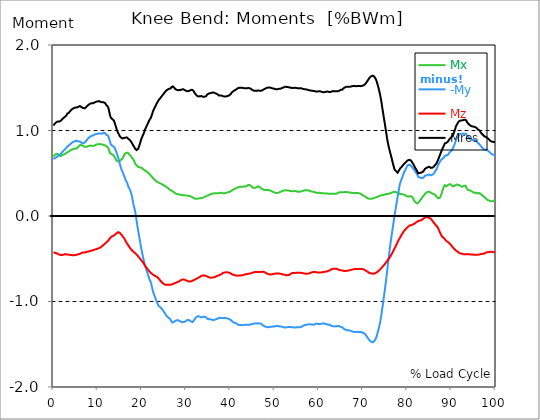
| Category |  Mx |  -My |  Mz |  Mres |
|---|---|---|---|---|
| 0.0 | 0.693 | 0.667 | -0.427 | 1.058 |
| 0.167348456675344 | 0.704 | 0.671 | -0.428 | 1.069 |
| 0.334696913350688 | 0.715 | 0.676 | -0.429 | 1.08 |
| 0.5020453700260321 | 0.722 | 0.68 | -0.431 | 1.089 |
| 0.669393826701376 | 0.727 | 0.686 | -0.435 | 1.096 |
| 0.83674228337672 | 0.727 | 0.693 | -0.439 | 1.102 |
| 1.0040907400520642 | 0.724 | 0.7 | -0.443 | 1.106 |
| 1.1621420602454444 | 0.718 | 0.706 | -0.447 | 1.106 |
| 1.3294905169207885 | 0.709 | 0.709 | -0.45 | 1.104 |
| 1.4968389735961325 | 0.701 | 0.717 | -0.454 | 1.105 |
| 1.6641874302714765 | 0.701 | 0.728 | -0.457 | 1.113 |
| 1.8315358869468206 | 0.707 | 0.736 | -0.458 | 1.122 |
| 1.9988843436221646 | 0.712 | 0.747 | -0.457 | 1.133 |
| 2.1662328002975086 | 0.717 | 0.756 | -0.455 | 1.14 |
| 2.333581256972853 | 0.721 | 0.766 | -0.451 | 1.149 |
| 2.5009297136481967 | 0.724 | 0.776 | -0.45 | 1.156 |
| 2.6682781703235405 | 0.726 | 0.782 | -0.447 | 1.162 |
| 2.8356266269988843 | 0.728 | 0.788 | -0.446 | 1.166 |
| 3.002975083674229 | 0.738 | 0.801 | -0.449 | 1.181 |
| 3.1703235403495724 | 0.749 | 0.815 | -0.45 | 1.198 |
| 3.337671997024917 | 0.75 | 0.821 | -0.452 | 1.205 |
| 3.4957233172182973 | 0.75 | 0.824 | -0.453 | 1.207 |
| 3.663071773893641 | 0.761 | 0.833 | -0.454 | 1.22 |
| 3.8304202305689854 | 0.768 | 0.841 | -0.456 | 1.231 |
| 3.997768687244329 | 0.773 | 0.849 | -0.456 | 1.238 |
| 4.165117143919673 | 0.776 | 0.857 | -0.458 | 1.247 |
| 4.332465600595017 | 0.779 | 0.863 | -0.459 | 1.253 |
| 4.499814057270361 | 0.78 | 0.867 | -0.46 | 1.258 |
| 4.667162513945706 | 0.784 | 0.871 | -0.46 | 1.263 |
| 4.834510970621049 | 0.789 | 0.874 | -0.458 | 1.267 |
| 5.001859427296393 | 0.789 | 0.879 | -0.455 | 1.269 |
| 5.169207883971737 | 0.791 | 0.881 | -0.454 | 1.272 |
| 5.336556340647081 | 0.793 | 0.877 | -0.452 | 1.27 |
| 5.503904797322425 | 0.803 | 0.874 | -0.45 | 1.273 |
| 5.671253253997769 | 0.812 | 0.872 | -0.448 | 1.277 |
| 5.82930457419115 | 0.82 | 0.872 | -0.446 | 1.28 |
| 5.996653030866494 | 0.829 | 0.871 | -0.443 | 1.286 |
| 6.164001487541838 | 0.834 | 0.867 | -0.439 | 1.285 |
| 6.331349944217181 | 0.83 | 0.856 | -0.434 | 1.274 |
| 6.498698400892526 | 0.827 | 0.85 | -0.43 | 1.266 |
| 6.66604685756787 | 0.822 | 0.851 | -0.428 | 1.264 |
| 6.833395314243213 | 0.814 | 0.852 | -0.426 | 1.259 |
| 7.000743770918558 | 0.809 | 0.856 | -0.426 | 1.259 |
| 7.168092227593902 | 0.808 | 0.863 | -0.425 | 1.263 |
| 7.335440684269246 | 0.81 | 0.872 | -0.423 | 1.269 |
| 7.50278914094459 | 0.809 | 0.883 | -0.421 | 1.276 |
| 7.6701375976199335 | 0.812 | 0.896 | -0.418 | 1.287 |
| 7.837486054295278 | 0.815 | 0.906 | -0.415 | 1.293 |
| 7.995537374488658 | 0.819 | 0.915 | -0.414 | 1.302 |
| 8.162885831164003 | 0.822 | 0.922 | -0.412 | 1.31 |
| 8.330234287839346 | 0.823 | 0.927 | -0.409 | 1.314 |
| 8.49758274451469 | 0.822 | 0.932 | -0.407 | 1.316 |
| 8.664931201190035 | 0.822 | 0.937 | -0.405 | 1.319 |
| 8.832279657865378 | 0.821 | 0.941 | -0.402 | 1.321 |
| 8.999628114540721 | 0.819 | 0.944 | -0.399 | 1.32 |
| 9.166976571216066 | 0.821 | 0.948 | -0.397 | 1.323 |
| 9.334325027891412 | 0.824 | 0.953 | -0.393 | 1.328 |
| 9.501673484566755 | 0.829 | 0.957 | -0.39 | 1.333 |
| 9.669021941242098 | 0.835 | 0.96 | -0.388 | 1.337 |
| 9.836370397917442 | 0.837 | 0.962 | -0.385 | 1.34 |
| 10.003718854592787 | 0.838 | 0.961 | -0.382 | 1.339 |
| 10.17106731126813 | 0.841 | 0.964 | -0.379 | 1.341 |
| 10.329118631461512 | 0.843 | 0.967 | -0.376 | 1.344 |
| 10.496467088136853 | 0.842 | 0.968 | -0.37 | 1.342 |
| 10.663815544812199 | 0.839 | 0.963 | -0.366 | 1.335 |
| 10.831164001487544 | 0.838 | 0.961 | -0.362 | 1.332 |
| 10.998512458162887 | 0.837 | 0.964 | -0.353 | 1.331 |
| 11.16586091483823 | 0.836 | 0.966 | -0.348 | 1.33 |
| 11.333209371513574 | 0.832 | 0.973 | -0.338 | 1.331 |
| 11.50055782818892 | 0.827 | 0.977 | -0.328 | 1.328 |
| 11.667906284864264 | 0.826 | 0.97 | -0.323 | 1.322 |
| 11.835254741539607 | 0.82 | 0.959 | -0.316 | 1.309 |
| 12.00260319821495 | 0.815 | 0.949 | -0.308 | 1.296 |
| 12.169951654890292 | 0.809 | 0.945 | -0.301 | 1.29 |
| 12.337300111565641 | 0.8 | 0.94 | -0.292 | 1.279 |
| 12.504648568240984 | 0.781 | 0.924 | -0.28 | 1.253 |
| 12.662699888434362 | 0.757 | 0.893 | -0.269 | 1.213 |
| 12.830048345109708 | 0.735 | 0.863 | -0.258 | 1.174 |
| 12.997396801785053 | 0.725 | 0.839 | -0.248 | 1.149 |
| 13.164745258460396 | 0.723 | 0.827 | -0.24 | 1.138 |
| 13.33209371513574 | 0.72 | 0.823 | -0.236 | 1.133 |
| 13.499442171811083 | 0.715 | 0.818 | -0.234 | 1.125 |
| 13.666790628486426 | 0.707 | 0.817 | -0.228 | 1.118 |
| 13.834139085161771 | 0.692 | 0.802 | -0.221 | 1.095 |
| 14.001487541837117 | 0.674 | 0.78 | -0.215 | 1.066 |
| 14.16883599851246 | 0.656 | 0.76 | -0.207 | 1.039 |
| 14.336184455187803 | 0.644 | 0.735 | -0.2 | 1.012 |
| 14.503532911863147 | 0.637 | 0.707 | -0.192 | 0.987 |
| 14.670881368538492 | 0.639 | 0.679 | -0.189 | 0.969 |
| 14.828932688731873 | 0.644 | 0.649 | -0.19 | 0.953 |
| 14.996281145407215 | 0.644 | 0.615 | -0.197 | 0.935 |
| 15.163629602082558 | 0.65 | 0.584 | -0.206 | 0.924 |
| 15.330978058757903 | 0.659 | 0.554 | -0.215 | 0.916 |
| 15.498326515433247 | 0.666 | 0.53 | -0.226 | 0.909 |
| 15.665674972108594 | 0.675 | 0.513 | -0.237 | 0.907 |
| 15.833023428783937 | 0.693 | 0.491 | -0.249 | 0.911 |
| 16.00037188545928 | 0.713 | 0.467 | -0.261 | 0.913 |
| 16.167720342134626 | 0.727 | 0.447 | -0.277 | 0.917 |
| 16.335068798809967 | 0.736 | 0.422 | -0.292 | 0.917 |
| 16.502417255485312 | 0.738 | 0.414 | -0.308 | 0.921 |
| 16.669765712160658 | 0.74 | 0.389 | -0.322 | 0.917 |
| 16.837114168836 | 0.739 | 0.362 | -0.336 | 0.909 |
| 17.004462625511344 | 0.731 | 0.337 | -0.348 | 0.9 |
| 17.16251394570472 | 0.72 | 0.323 | -0.362 | 0.893 |
| 17.32986240238007 | 0.713 | 0.303 | -0.374 | 0.887 |
| 17.497210859055414 | 0.702 | 0.28 | -0.385 | 0.875 |
| 17.664559315730756 | 0.691 | 0.254 | -0.396 | 0.863 |
| 17.8319077724061 | 0.679 | 0.21 | -0.405 | 0.847 |
| 17.999256229081443 | 0.667 | 0.167 | -0.413 | 0.832 |
| 18.166604685756788 | 0.653 | 0.121 | -0.421 | 0.818 |
| 18.333953142432133 | 0.633 | 0.089 | -0.428 | 0.802 |
| 18.501301599107478 | 0.613 | 0.051 | -0.436 | 0.786 |
| 18.668650055782823 | 0.6 | -0.001 | -0.443 | 0.777 |
| 18.835998512458165 | 0.591 | -0.062 | -0.451 | 0.771 |
| 19.00334696913351 | 0.582 | -0.116 | -0.461 | 0.775 |
| 19.170695425808855 | 0.575 | -0.169 | -0.471 | 0.786 |
| 19.338043882484197 | 0.571 | -0.22 | -0.481 | 0.807 |
| 19.496095202677576 | 0.57 | -0.27 | -0.493 | 0.834 |
| 19.66344365935292 | 0.568 | -0.319 | -0.504 | 0.862 |
| 19.830792116028263 | 0.565 | -0.365 | -0.514 | 0.893 |
| 19.998140572703612 | 0.562 | -0.41 | -0.526 | 0.916 |
| 20.165489029378953 | 0.554 | -0.453 | -0.537 | 0.936 |
| 20.3328374860543 | 0.546 | -0.497 | -0.549 | 0.954 |
| 20.500185942729644 | 0.538 | -0.532 | -0.562 | 0.976 |
| 20.667534399404985 | 0.533 | -0.573 | -0.575 | 1 |
| 20.83488285608033 | 0.527 | -0.601 | -0.589 | 1.022 |
| 21.002231312755672 | 0.523 | -0.623 | -0.601 | 1.042 |
| 21.16957976943102 | 0.518 | -0.65 | -0.612 | 1.062 |
| 21.336928226106362 | 0.51 | -0.676 | -0.623 | 1.079 |
| 21.504276682781704 | 0.502 | -0.704 | -0.635 | 1.098 |
| 21.67162513945705 | 0.493 | -0.732 | -0.645 | 1.118 |
| 21.82967645965043 | 0.484 | -0.751 | -0.655 | 1.132 |
| 21.997024916325774 | 0.475 | -0.769 | -0.664 | 1.145 |
| 22.16437337300112 | 0.464 | -0.801 | -0.671 | 1.165 |
| 22.33172182967646 | 0.455 | -0.839 | -0.678 | 1.193 |
| 22.499070286351806 | 0.444 | -0.878 | -0.685 | 1.221 |
| 22.666418743027148 | 0.435 | -0.904 | -0.691 | 1.241 |
| 22.833767199702496 | 0.427 | -0.927 | -0.695 | 1.259 |
| 23.00111565637784 | 0.42 | -0.95 | -0.701 | 1.277 |
| 23.168464113053183 | 0.413 | -0.975 | -0.705 | 1.295 |
| 23.335812569728528 | 0.407 | -0.998 | -0.709 | 1.313 |
| 23.50316102640387 | 0.402 | -1.018 | -0.716 | 1.327 |
| 23.670509483079215 | 0.395 | -1.039 | -0.723 | 1.344 |
| 23.83785793975456 | 0.389 | -1.053 | -0.734 | 1.358 |
| 23.995909259947936 | 0.384 | -1.063 | -0.744 | 1.369 |
| 24.163257716623285 | 0.379 | -1.066 | -0.755 | 1.377 |
| 24.330606173298627 | 0.379 | -1.078 | -0.764 | 1.39 |
| 24.49795462997397 | 0.374 | -1.086 | -0.774 | 1.401 |
| 24.665303086649313 | 0.368 | -1.094 | -0.782 | 1.411 |
| 24.83265154332466 | 0.364 | -1.107 | -0.79 | 1.423 |
| 25.0 | 0.358 | -1.121 | -0.795 | 1.435 |
| 25.167348456675345 | 0.353 | -1.134 | -0.8 | 1.446 |
| 25.334696913350694 | 0.349 | -1.146 | -0.803 | 1.456 |
| 25.502045370026035 | 0.344 | -1.16 | -0.805 | 1.466 |
| 25.669393826701377 | 0.336 | -1.174 | -0.806 | 1.476 |
| 25.836742283376722 | 0.33 | -1.18 | -0.805 | 1.479 |
| 26.004090740052067 | 0.323 | -1.189 | -0.805 | 1.484 |
| 26.17143919672741 | 0.317 | -1.197 | -0.806 | 1.489 |
| 26.329490516920792 | 0.308 | -1.201 | -0.805 | 1.489 |
| 26.49683897359613 | 0.301 | -1.207 | -0.804 | 1.491 |
| 26.66418743027148 | 0.298 | -1.229 | -0.802 | 1.506 |
| 26.831535886946828 | 0.294 | -1.245 | -0.799 | 1.516 |
| 26.998884343622166 | 0.288 | -1.249 | -0.797 | 1.516 |
| 27.166232800297514 | 0.281 | -1.241 | -0.793 | 1.507 |
| 27.333581256972852 | 0.274 | -1.237 | -0.788 | 1.499 |
| 27.5009297136482 | 0.267 | -1.228 | -0.785 | 1.489 |
| 27.668278170323543 | 0.262 | -1.222 | -0.781 | 1.481 |
| 27.835626626998888 | 0.26 | -1.221 | -0.777 | 1.477 |
| 28.002975083674233 | 0.256 | -1.22 | -0.774 | 1.474 |
| 28.170323540349575 | 0.254 | -1.218 | -0.77 | 1.47 |
| 28.33767199702492 | 0.252 | -1.221 | -0.766 | 1.471 |
| 28.50502045370026 | 0.25 | -1.228 | -0.76 | 1.474 |
| 28.663071773893645 | 0.25 | -1.232 | -0.756 | 1.475 |
| 28.830420230568986 | 0.248 | -1.236 | -0.751 | 1.475 |
| 28.99776868724433 | 0.245 | -1.241 | -0.746 | 1.478 |
| 29.165117143919673 | 0.243 | -1.243 | -0.742 | 1.478 |
| 29.33246560059502 | 0.244 | -1.25 | -0.742 | 1.483 |
| 29.499814057270367 | 0.242 | -1.24 | -0.742 | 1.474 |
| 29.66716251394571 | 0.242 | -1.239 | -0.745 | 1.474 |
| 29.834510970621054 | 0.241 | -1.234 | -0.749 | 1.47 |
| 30.00185942729639 | 0.24 | -1.226 | -0.753 | 1.464 |
| 30.169207883971744 | 0.239 | -1.221 | -0.756 | 1.462 |
| 30.33655634064708 | 0.237 | -1.218 | -0.759 | 1.46 |
| 30.50390479732243 | 0.237 | -1.214 | -0.763 | 1.459 |
| 30.671253253997772 | 0.237 | -1.215 | -0.766 | 1.462 |
| 30.829304574191156 | 0.234 | -1.222 | -0.767 | 1.467 |
| 30.996653030866494 | 0.23 | -1.229 | -0.766 | 1.472 |
| 31.164001487541842 | 0.226 | -1.235 | -0.764 | 1.476 |
| 31.331349944217187 | 0.223 | -1.237 | -0.761 | 1.476 |
| 31.498698400892525 | 0.219 | -1.24 | -0.756 | 1.475 |
| 31.666046857567874 | 0.212 | -1.234 | -0.751 | 1.465 |
| 31.833395314243212 | 0.207 | -1.216 | -0.748 | 1.449 |
| 32.00074377091856 | 0.203 | -1.205 | -0.743 | 1.436 |
| 32.1680922275939 | 0.201 | -1.191 | -0.739 | 1.423 |
| 32.33544068426925 | 0.202 | -1.181 | -0.735 | 1.413 |
| 32.50278914094459 | 0.203 | -1.175 | -0.731 | 1.406 |
| 32.670137597619934 | 0.204 | -1.172 | -0.725 | 1.401 |
| 32.83748605429528 | 0.205 | -1.172 | -0.721 | 1.398 |
| 33.004834510970625 | 0.206 | -1.174 | -0.717 | 1.398 |
| 33.162885831164004 | 0.207 | -1.18 | -0.711 | 1.401 |
| 33.33023428783935 | 0.209 | -1.186 | -0.705 | 1.405 |
| 33.497582744514695 | 0.21 | -1.186 | -0.701 | 1.403 |
| 33.664931201190036 | 0.212 | -1.182 | -0.698 | 1.398 |
| 33.83227965786538 | 0.215 | -1.178 | -0.696 | 1.393 |
| 33.99962811454073 | 0.219 | -1.179 | -0.695 | 1.393 |
| 34.16697657121607 | 0.223 | -1.179 | -0.696 | 1.394 |
| 34.33432502789141 | 0.227 | -1.181 | -0.698 | 1.397 |
| 34.50167348456676 | 0.232 | -1.182 | -0.7 | 1.4 |
| 34.6690219412421 | 0.236 | -1.189 | -0.705 | 1.409 |
| 34.83637039791744 | 0.236 | -1.203 | -0.71 | 1.423 |
| 35.00371885459279 | 0.241 | -1.206 | -0.713 | 1.429 |
| 35.17106731126814 | 0.245 | -1.208 | -0.716 | 1.433 |
| 35.338415767943474 | 0.249 | -1.208 | -0.72 | 1.436 |
| 35.49646708813686 | 0.254 | -1.207 | -0.722 | 1.436 |
| 35.6638155448122 | 0.258 | -1.207 | -0.722 | 1.437 |
| 35.831164001487544 | 0.261 | -1.212 | -0.721 | 1.441 |
| 35.998512458162885 | 0.262 | -1.217 | -0.72 | 1.444 |
| 36.165860914838234 | 0.262 | -1.219 | -0.718 | 1.446 |
| 36.333209371513576 | 0.264 | -1.216 | -0.716 | 1.442 |
| 36.50055782818892 | 0.264 | -1.212 | -0.713 | 1.438 |
| 36.667906284864266 | 0.267 | -1.207 | -0.71 | 1.435 |
| 36.83525474153961 | 0.267 | -1.207 | -0.707 | 1.432 |
| 37.002603198214956 | 0.265 | -1.207 | -0.702 | 1.429 |
| 37.1699516548903 | 0.264 | -1.201 | -0.697 | 1.421 |
| 37.337300111565646 | 0.265 | -1.193 | -0.694 | 1.414 |
| 37.50464856824098 | 0.266 | -1.19 | -0.691 | 1.408 |
| 37.66269988843437 | 0.27 | -1.191 | -0.688 | 1.408 |
| 37.83004834510971 | 0.274 | -1.193 | -0.685 | 1.41 |
| 37.99739680178505 | 0.272 | -1.195 | -0.68 | 1.409 |
| 38.16474525846039 | 0.267 | -1.194 | -0.673 | 1.405 |
| 38.33209371513574 | 0.265 | -1.194 | -0.666 | 1.401 |
| 38.49944217181109 | 0.264 | -1.194 | -0.663 | 1.399 |
| 38.666790628486424 | 0.266 | -1.193 | -0.661 | 1.397 |
| 38.83413908516178 | 0.268 | -1.193 | -0.659 | 1.397 |
| 39.001487541837115 | 0.27 | -1.193 | -0.659 | 1.398 |
| 39.16883599851246 | 0.274 | -1.195 | -0.659 | 1.4 |
| 39.336184455187805 | 0.276 | -1.197 | -0.659 | 1.402 |
| 39.503532911863154 | 0.279 | -1.199 | -0.66 | 1.405 |
| 39.670881368538495 | 0.28 | -1.205 | -0.662 | 1.41 |
| 39.83822982521384 | 0.28 | -1.208 | -0.664 | 1.415 |
| 39.996281145407224 | 0.286 | -1.21 | -0.668 | 1.42 |
| 40.163629602082565 | 0.292 | -1.218 | -0.673 | 1.43 |
| 40.33097805875791 | 0.298 | -1.229 | -0.679 | 1.444 |
| 40.498326515433256 | 0.304 | -1.236 | -0.684 | 1.453 |
| 40.6656749721086 | 0.308 | -1.24 | -0.688 | 1.459 |
| 40.83302342878393 | 0.314 | -1.246 | -0.69 | 1.466 |
| 41.00037188545929 | 0.319 | -1.249 | -0.692 | 1.47 |
| 41.16772034213463 | 0.321 | -1.252 | -0.693 | 1.475 |
| 41.33506879880997 | 0.324 | -1.256 | -0.697 | 1.48 |
| 41.50241725548531 | 0.331 | -1.26 | -0.699 | 1.485 |
| 41.66976571216066 | 0.334 | -1.268 | -0.698 | 1.493 |
| 41.837114168836 | 0.337 | -1.273 | -0.697 | 1.497 |
| 42.004462625511344 | 0.34 | -1.275 | -0.696 | 1.499 |
| 42.17181108218669 | 0.341 | -1.276 | -0.696 | 1.5 |
| 42.32986240238007 | 0.341 | -1.276 | -0.695 | 1.5 |
| 42.497210859055414 | 0.341 | -1.276 | -0.695 | 1.5 |
| 42.66455931573076 | 0.342 | -1.276 | -0.693 | 1.5 |
| 42.831907772406105 | 0.343 | -1.277 | -0.692 | 1.499 |
| 42.999256229081446 | 0.344 | -1.274 | -0.69 | 1.496 |
| 43.16660468575679 | 0.343 | -1.274 | -0.687 | 1.496 |
| 43.33395314243214 | 0.345 | -1.274 | -0.683 | 1.494 |
| 43.50130159910748 | 0.347 | -1.272 | -0.681 | 1.493 |
| 43.66865005578282 | 0.349 | -1.272 | -0.679 | 1.493 |
| 43.83599851245817 | 0.355 | -1.272 | -0.679 | 1.494 |
| 44.00334696913351 | 0.362 | -1.272 | -0.677 | 1.496 |
| 44.17069542580886 | 0.364 | -1.271 | -0.676 | 1.496 |
| 44.3380438824842 | 0.364 | -1.271 | -0.675 | 1.495 |
| 44.49609520267758 | 0.361 | -1.271 | -0.672 | 1.493 |
| 44.66344365935292 | 0.351 | -1.267 | -0.67 | 1.487 |
| 44.83079211602827 | 0.343 | -1.264 | -0.667 | 1.479 |
| 44.99814057270361 | 0.335 | -1.262 | -0.664 | 1.473 |
| 45.16548902937895 | 0.33 | -1.26 | -0.661 | 1.469 |
| 45.332837486054295 | 0.33 | -1.259 | -0.658 | 1.466 |
| 45.500185942729644 | 0.33 | -1.258 | -0.656 | 1.464 |
| 45.66753439940499 | 0.33 | -1.258 | -0.655 | 1.464 |
| 45.83488285608033 | 0.332 | -1.257 | -0.654 | 1.464 |
| 46.00223131275568 | 0.338 | -1.255 | -0.655 | 1.464 |
| 46.16957976943102 | 0.343 | -1.255 | -0.654 | 1.466 |
| 46.336928226106366 | 0.347 | -1.255 | -0.655 | 1.468 |
| 46.50427668278171 | 0.345 | -1.256 | -0.655 | 1.468 |
| 46.671625139457056 | 0.337 | -1.256 | -0.655 | 1.465 |
| 46.829676459650436 | 0.328 | -1.256 | -0.654 | 1.462 |
| 46.99702491632577 | 0.321 | -1.263 | -0.652 | 1.464 |
| 47.16437337300112 | 0.318 | -1.269 | -0.652 | 1.468 |
| 47.33172182967646 | 0.313 | -1.277 | -0.651 | 1.473 |
| 47.49907028635181 | 0.308 | -1.283 | -0.652 | 1.478 |
| 47.66641874302716 | 0.306 | -1.29 | -0.655 | 1.484 |
| 47.83376719970249 | 0.302 | -1.293 | -0.66 | 1.487 |
| 48.001115656377834 | 0.304 | -1.295 | -0.664 | 1.492 |
| 48.16846411305319 | 0.306 | -1.297 | -0.669 | 1.496 |
| 48.33581256972853 | 0.306 | -1.3 | -0.673 | 1.5 |
| 48.50316102640387 | 0.304 | -1.301 | -0.677 | 1.502 |
| 48.67050948307921 | 0.304 | -1.3 | -0.681 | 1.503 |
| 48.837857939754564 | 0.301 | -1.298 | -0.682 | 1.502 |
| 49.005206396429905 | 0.299 | -1.297 | -0.684 | 1.502 |
| 49.163257716623285 | 0.295 | -1.296 | -0.684 | 1.5 |
| 49.33060617329863 | 0.291 | -1.294 | -0.683 | 1.496 |
| 49.49795462997397 | 0.287 | -1.293 | -0.681 | 1.494 |
| 49.66530308664932 | 0.282 | -1.293 | -0.679 | 1.492 |
| 49.832651543324666 | 0.279 | -1.293 | -0.676 | 1.491 |
| 50.0 | 0.275 | -1.292 | -0.675 | 1.488 |
| 50.16734845667534 | 0.272 | -1.289 | -0.674 | 1.484 |
| 50.33469691335069 | 0.27 | -1.287 | -0.673 | 1.482 |
| 50.50204537002604 | 0.27 | -1.287 | -0.673 | 1.481 |
| 50.66939382670139 | 0.27 | -1.288 | -0.673 | 1.483 |
| 50.836742283376715 | 0.272 | -1.288 | -0.673 | 1.484 |
| 51.00409074005207 | 0.275 | -1.292 | -0.673 | 1.487 |
| 51.17143919672741 | 0.278 | -1.292 | -0.673 | 1.489 |
| 51.32949051692079 | 0.282 | -1.292 | -0.675 | 1.49 |
| 51.496838973596134 | 0.286 | -1.293 | -0.677 | 1.493 |
| 51.66418743027148 | 0.291 | -1.293 | -0.679 | 1.495 |
| 51.831535886946824 | 0.293 | -1.296 | -0.682 | 1.499 |
| 51.99888434362217 | 0.296 | -1.3 | -0.684 | 1.504 |
| 52.16623280029752 | 0.299 | -1.304 | -0.686 | 1.508 |
| 52.33358125697285 | 0.3 | -1.304 | -0.689 | 1.51 |
| 52.5009297136482 | 0.301 | -1.303 | -0.691 | 1.51 |
| 52.668278170323546 | 0.3 | -1.302 | -0.693 | 1.51 |
| 52.835626626998895 | 0.299 | -1.302 | -0.693 | 1.51 |
| 53.00297508367424 | 0.298 | -1.3 | -0.692 | 1.507 |
| 53.17032354034958 | 0.296 | -1.297 | -0.69 | 1.505 |
| 53.33767199702492 | 0.296 | -1.297 | -0.689 | 1.505 |
| 53.50502045370027 | 0.295 | -1.298 | -0.685 | 1.504 |
| 53.663071773893655 | 0.292 | -1.299 | -0.677 | 1.5 |
| 53.83042023056899 | 0.29 | -1.3 | -0.669 | 1.498 |
| 53.99776868724433 | 0.29 | -1.301 | -0.667 | 1.498 |
| 54.16511714391967 | 0.29 | -1.301 | -0.666 | 1.497 |
| 54.33246560059503 | 0.291 | -1.302 | -0.666 | 1.498 |
| 54.49981405727037 | 0.292 | -1.304 | -0.666 | 1.5 |
| 54.667162513945705 | 0.293 | -1.304 | -0.665 | 1.5 |
| 54.834510970621054 | 0.291 | -1.303 | -0.664 | 1.498 |
| 55.0018594272964 | 0.288 | -1.302 | -0.664 | 1.496 |
| 55.169207883971744 | 0.285 | -1.301 | -0.664 | 1.494 |
| 55.336556340647086 | 0.283 | -1.3 | -0.664 | 1.493 |
| 55.50390479732243 | 0.282 | -1.302 | -0.664 | 1.494 |
| 55.671253253997776 | 0.284 | -1.3 | -0.664 | 1.494 |
| 55.83860171067312 | 0.287 | -1.3 | -0.664 | 1.494 |
| 55.9966530308665 | 0.288 | -1.297 | -0.664 | 1.493 |
| 56.16400148754184 | 0.29 | -1.293 | -0.665 | 1.491 |
| 56.33134994421718 | 0.292 | -1.289 | -0.667 | 1.489 |
| 56.498698400892536 | 0.294 | -1.284 | -0.67 | 1.486 |
| 56.66604685756788 | 0.298 | -1.279 | -0.672 | 1.483 |
| 56.83339531424321 | 0.302 | -1.276 | -0.674 | 1.481 |
| 57.00074377091856 | 0.303 | -1.274 | -0.675 | 1.481 |
| 57.16809222759391 | 0.303 | -1.273 | -0.677 | 1.481 |
| 57.33544068426925 | 0.302 | -1.271 | -0.677 | 1.479 |
| 57.5027891409446 | 0.301 | -1.268 | -0.676 | 1.477 |
| 57.670137597619934 | 0.3 | -1.265 | -0.673 | 1.473 |
| 57.83748605429528 | 0.295 | -1.266 | -0.671 | 1.471 |
| 58.004834510970625 | 0.293 | -1.266 | -0.668 | 1.469 |
| 58.16288583116401 | 0.291 | -1.268 | -0.664 | 1.468 |
| 58.330234287839346 | 0.287 | -1.27 | -0.661 | 1.466 |
| 58.497582744514695 | 0.285 | -1.27 | -0.658 | 1.464 |
| 58.66493120119004 | 0.284 | -1.27 | -0.656 | 1.464 |
| 58.832279657865385 | 0.281 | -1.271 | -0.654 | 1.463 |
| 58.999628114540734 | 0.28 | -1.27 | -0.653 | 1.462 |
| 59.16697657121607 | 0.277 | -1.265 | -0.654 | 1.458 |
| 59.33432502789142 | 0.275 | -1.262 | -0.656 | 1.455 |
| 59.50167348456676 | 0.268 | -1.258 | -0.66 | 1.453 |
| 59.66902194124211 | 0.269 | -1.26 | -0.661 | 1.455 |
| 59.83637039791745 | 0.271 | -1.262 | -0.661 | 1.457 |
| 60.00371885459278 | 0.271 | -1.263 | -0.662 | 1.458 |
| 60.17106731126813 | 0.271 | -1.263 | -0.663 | 1.458 |
| 60.33841576794349 | 0.27 | -1.263 | -0.662 | 1.458 |
| 60.49646708813685 | 0.27 | -1.262 | -0.661 | 1.456 |
| 60.6638155448122 | 0.267 | -1.259 | -0.659 | 1.452 |
| 60.831164001487544 | 0.266 | -1.258 | -0.656 | 1.45 |
| 60.99851245816289 | 0.265 | -1.256 | -0.655 | 1.448 |
| 61.16586091483824 | 0.265 | -1.255 | -0.654 | 1.447 |
| 61.333209371513576 | 0.264 | -1.259 | -0.652 | 1.45 |
| 61.50055782818892 | 0.264 | -1.263 | -0.651 | 1.452 |
| 61.667906284864266 | 0.264 | -1.264 | -0.65 | 1.453 |
| 61.835254741539615 | 0.263 | -1.266 | -0.649 | 1.453 |
| 62.002603198214956 | 0.263 | -1.27 | -0.646 | 1.456 |
| 62.16995165489029 | 0.261 | -1.271 | -0.642 | 1.454 |
| 62.33730011156564 | 0.26 | -1.27 | -0.638 | 1.451 |
| 62.504648568240995 | 0.259 | -1.271 | -0.634 | 1.45 |
| 62.67199702491633 | 0.259 | -1.275 | -0.63 | 1.451 |
| 62.83004834510971 | 0.261 | -1.284 | -0.623 | 1.457 |
| 62.99739680178505 | 0.261 | -1.287 | -0.621 | 1.458 |
| 63.1647452584604 | 0.26 | -1.288 | -0.62 | 1.457 |
| 63.33209371513575 | 0.26 | -1.289 | -0.618 | 1.458 |
| 63.4994421718111 | 0.259 | -1.292 | -0.616 | 1.459 |
| 63.666790628486424 | 0.259 | -1.291 | -0.616 | 1.459 |
| 63.83413908516177 | 0.261 | -1.29 | -0.616 | 1.458 |
| 64.00148754183712 | 0.262 | -1.29 | -0.617 | 1.459 |
| 64.16883599851248 | 0.264 | -1.288 | -0.619 | 1.458 |
| 64.3361844551878 | 0.27 | -1.285 | -0.623 | 1.459 |
| 64.50353291186315 | 0.276 | -1.286 | -0.63 | 1.463 |
| 64.6708813685385 | 0.277 | -1.29 | -0.633 | 1.467 |
| 64.83822982521384 | 0.278 | -1.295 | -0.634 | 1.473 |
| 65.00557828188919 | 0.278 | -1.299 | -0.635 | 1.477 |
| 65.16362960208257 | 0.278 | -1.298 | -0.636 | 1.477 |
| 65.3309780587579 | 0.279 | -1.298 | -0.636 | 1.477 |
| 65.49832651543326 | 0.279 | -1.31 | -0.639 | 1.489 |
| 65.6656749721086 | 0.278 | -1.319 | -0.642 | 1.497 |
| 65.83302342878395 | 0.279 | -1.323 | -0.642 | 1.502 |
| 66.00037188545929 | 0.28 | -1.329 | -0.643 | 1.507 |
| 66.16772034213463 | 0.279 | -1.334 | -0.642 | 1.51 |
| 66.33506879880998 | 0.279 | -1.336 | -0.641 | 1.512 |
| 66.50241725548531 | 0.279 | -1.336 | -0.64 | 1.513 |
| 66.66976571216065 | 0.279 | -1.337 | -0.638 | 1.513 |
| 66.83711416883601 | 0.277 | -1.338 | -0.636 | 1.513 |
| 67.00446262551135 | 0.275 | -1.339 | -0.634 | 1.512 |
| 67.1718110821867 | 0.274 | -1.341 | -0.631 | 1.512 |
| 67.32986240238007 | 0.272 | -1.346 | -0.629 | 1.515 |
| 67.49721085905541 | 0.269 | -1.35 | -0.626 | 1.518 |
| 67.66455931573076 | 0.269 | -1.352 | -0.625 | 1.519 |
| 67.83190777240611 | 0.27 | -1.354 | -0.623 | 1.521 |
| 67.99925622908145 | 0.271 | -1.356 | -0.621 | 1.521 |
| 68.16660468575678 | 0.269 | -1.357 | -0.62 | 1.521 |
| 68.33395314243214 | 0.269 | -1.356 | -0.62 | 1.52 |
| 68.50130159910749 | 0.269 | -1.354 | -0.619 | 1.518 |
| 68.66865005578282 | 0.268 | -1.354 | -0.619 | 1.518 |
| 68.83599851245816 | 0.269 | -1.357 | -0.62 | 1.521 |
| 69.00334696913352 | 0.267 | -1.357 | -0.62 | 1.521 |
| 69.17069542580886 | 0.264 | -1.358 | -0.621 | 1.521 |
| 69.3380438824842 | 0.263 | -1.358 | -0.62 | 1.521 |
| 69.50539233915956 | 0.257 | -1.357 | -0.618 | 1.519 |
| 69.66344365935292 | 0.252 | -1.359 | -0.619 | 1.52 |
| 69.83079211602826 | 0.248 | -1.362 | -0.621 | 1.522 |
| 69.99814057270362 | 0.243 | -1.365 | -0.622 | 1.525 |
| 70.16548902937896 | 0.237 | -1.369 | -0.626 | 1.53 |
| 70.33283748605429 | 0.232 | -1.375 | -0.63 | 1.535 |
| 70.50018594272964 | 0.226 | -1.381 | -0.634 | 1.541 |
| 70.667534399405 | 0.221 | -1.39 | -0.64 | 1.55 |
| 70.83488285608033 | 0.211 | -1.407 | -0.645 | 1.565 |
| 71.00223131275568 | 0.208 | -1.416 | -0.65 | 1.576 |
| 71.16957976943102 | 0.205 | -1.432 | -0.656 | 1.593 |
| 71.33692822610637 | 0.203 | -1.441 | -0.664 | 1.605 |
| 71.50427668278171 | 0.203 | -1.454 | -0.667 | 1.618 |
| 71.67162513945706 | 0.202 | -1.465 | -0.669 | 1.629 |
| 71.8389735961324 | 0.203 | -1.469 | -0.672 | 1.634 |
| 71.99702491632577 | 0.203 | -1.476 | -0.673 | 1.639 |
| 72.16437337300113 | 0.204 | -1.478 | -0.674 | 1.641 |
| 72.33172182967647 | 0.207 | -1.473 | -0.675 | 1.637 |
| 72.49907028635181 | 0.209 | -1.467 | -0.674 | 1.633 |
| 72.66641874302715 | 0.212 | -1.457 | -0.671 | 1.623 |
| 72.8337671997025 | 0.216 | -1.441 | -0.668 | 1.608 |
| 73.00111565637783 | 0.22 | -1.421 | -0.663 | 1.589 |
| 73.16846411305319 | 0.222 | -1.394 | -0.658 | 1.563 |
| 73.33581256972853 | 0.225 | -1.363 | -0.651 | 1.533 |
| 73.50316102640387 | 0.23 | -1.331 | -0.643 | 1.501 |
| 73.67050948307921 | 0.234 | -1.294 | -0.635 | 1.467 |
| 73.83785793975457 | 0.237 | -1.257 | -0.626 | 1.43 |
| 74.00520639642991 | 0.239 | -1.207 | -0.618 | 1.384 |
| 74.16325771662328 | 0.242 | -1.158 | -0.609 | 1.337 |
| 74.33060617329863 | 0.244 | -1.093 | -0.599 | 1.278 |
| 74.49795462997398 | 0.245 | -1.036 | -0.59 | 1.226 |
| 74.66530308664932 | 0.247 | -0.969 | -0.58 | 1.169 |
| 74.83265154332466 | 0.25 | -0.907 | -0.569 | 1.116 |
| 75.00000000000001 | 0.253 | -0.845 | -0.559 | 1.062 |
| 75.16734845667534 | 0.256 | -0.775 | -0.548 | 1.006 |
| 75.3346969133507 | 0.257 | -0.703 | -0.536 | 0.95 |
| 75.50204537002605 | 0.258 | -0.629 | -0.524 | 0.893 |
| 75.66939382670138 | 0.259 | -0.552 | -0.512 | 0.85 |
| 75.83674228337672 | 0.26 | -0.48 | -0.501 | 0.808 |
| 76.00409074005208 | 0.263 | -0.411 | -0.488 | 0.774 |
| 76.17143919672742 | 0.265 | -0.343 | -0.475 | 0.739 |
| 76.33878765340276 | 0.269 | -0.28 | -0.461 | 0.707 |
| 76.49683897359614 | 0.273 | -0.221 | -0.445 | 0.673 |
| 76.66418743027148 | 0.277 | -0.163 | -0.428 | 0.636 |
| 76.83153588694682 | 0.279 | -0.106 | -0.412 | 0.602 |
| 76.99888434362218 | 0.281 | -0.045 | -0.395 | 0.57 |
| 77.16623280029752 | 0.281 | 0.013 | -0.378 | 0.541 |
| 77.33358125697285 | 0.283 | 0.064 | -0.362 | 0.53 |
| 77.5009297136482 | 0.279 | 0.118 | -0.343 | 0.524 |
| 77.66827817032356 | 0.275 | 0.171 | -0.325 | 0.52 |
| 77.83562662699889 | 0.271 | 0.223 | -0.306 | 0.507 |
| 78.00297508367423 | 0.266 | 0.271 | -0.288 | 0.515 |
| 78.17032354034959 | 0.263 | 0.324 | -0.272 | 0.534 |
| 78.33767199702493 | 0.259 | 0.368 | -0.257 | 0.55 |
| 78.50502045370027 | 0.258 | 0.398 | -0.242 | 0.563 |
| 78.67236891037561 | 0.256 | 0.421 | -0.226 | 0.57 |
| 78.83042023056899 | 0.255 | 0.443 | -0.211 | 0.579 |
| 78.99776868724433 | 0.254 | 0.468 | -0.198 | 0.591 |
| 79.16511714391969 | 0.252 | 0.493 | -0.184 | 0.602 |
| 79.33246560059503 | 0.25 | 0.516 | -0.172 | 0.612 |
| 79.49981405727036 | 0.244 | 0.531 | -0.164 | 0.619 |
| 79.66716251394571 | 0.239 | 0.549 | -0.154 | 0.628 |
| 79.83451097062107 | 0.233 | 0.567 | -0.145 | 0.637 |
| 80.00185942729641 | 0.23 | 0.584 | -0.136 | 0.648 |
| 80.16920788397174 | 0.228 | 0.593 | -0.126 | 0.651 |
| 80.33655634064709 | 0.226 | 0.599 | -0.119 | 0.655 |
| 80.50390479732243 | 0.227 | 0.602 | -0.111 | 0.657 |
| 80.67125325399778 | 0.233 | 0.597 | -0.109 | 0.655 |
| 80.83860171067312 | 0.235 | 0.591 | -0.107 | 0.65 |
| 80.99665303086651 | 0.228 | 0.579 | -0.107 | 0.637 |
| 81.16400148754184 | 0.221 | 0.569 | -0.104 | 0.626 |
| 81.3313499442172 | 0.207 | 0.558 | -0.098 | 0.611 |
| 81.49869840089255 | 0.188 | 0.549 | -0.093 | 0.595 |
| 81.66604685756786 | 0.174 | 0.534 | -0.089 | 0.578 |
| 81.83339531424322 | 0.163 | 0.521 | -0.081 | 0.562 |
| 82.00074377091858 | 0.154 | 0.508 | -0.075 | 0.548 |
| 82.16809222759392 | 0.15 | 0.493 | -0.069 | 0.532 |
| 82.33544068426926 | 0.148 | 0.478 | -0.064 | 0.515 |
| 82.50278914094459 | 0.151 | 0.458 | -0.058 | 0.498 |
| 82.67013759761994 | 0.163 | 0.45 | -0.056 | 0.494 |
| 82.83748605429528 | 0.179 | 0.451 | -0.055 | 0.504 |
| 83.00483451097062 | 0.189 | 0.45 | -0.051 | 0.507 |
| 83.17218296764597 | 0.2 | 0.445 | -0.047 | 0.507 |
| 83.33023428783935 | 0.213 | 0.44 | -0.044 | 0.507 |
| 83.4975827445147 | 0.224 | 0.443 | -0.04 | 0.515 |
| 83.66493120119004 | 0.236 | 0.443 | -0.031 | 0.519 |
| 83.83227965786537 | 0.245 | 0.458 | -0.024 | 0.535 |
| 83.99962811454073 | 0.255 | 0.471 | -0.018 | 0.55 |
| 84.16697657121607 | 0.265 | 0.47 | -0.013 | 0.555 |
| 84.33432502789142 | 0.273 | 0.474 | -0.013 | 0.562 |
| 84.50167348456677 | 0.279 | 0.478 | -0.014 | 0.568 |
| 84.6690219412421 | 0.282 | 0.48 | -0.016 | 0.571 |
| 84.83637039791745 | 0.284 | 0.483 | -0.019 | 0.575 |
| 85.0037188545928 | 0.285 | 0.485 | -0.021 | 0.576 |
| 85.17106731126813 | 0.28 | 0.479 | -0.025 | 0.569 |
| 85.33841576794349 | 0.273 | 0.476 | -0.033 | 0.563 |
| 85.50576422461883 | 0.267 | 0.479 | -0.043 | 0.564 |
| 85.66381554481221 | 0.264 | 0.482 | -0.053 | 0.565 |
| 85.83116400148755 | 0.257 | 0.485 | -0.065 | 0.566 |
| 85.99851245816289 | 0.256 | 0.495 | -0.077 | 0.576 |
| 86.16586091483823 | 0.255 | 0.508 | -0.087 | 0.588 |
| 86.33320937151358 | 0.247 | 0.523 | -0.098 | 0.599 |
| 86.50055782818893 | 0.236 | 0.534 | -0.108 | 0.607 |
| 86.66790628486427 | 0.223 | 0.55 | -0.116 | 0.619 |
| 86.83525474153961 | 0.214 | 0.575 | -0.126 | 0.64 |
| 87.00260319821496 | 0.207 | 0.593 | -0.143 | 0.659 |
| 87.16995165489031 | 0.207 | 0.611 | -0.163 | 0.68 |
| 87.33730011156564 | 0.211 | 0.628 | -0.183 | 0.703 |
| 87.504648568241 | 0.223 | 0.643 | -0.202 | 0.726 |
| 87.67199702491634 | 0.245 | 0.655 | -0.221 | 0.749 |
| 87.83004834510972 | 0.268 | 0.663 | -0.236 | 0.768 |
| 87.99739680178506 | 0.302 | 0.671 | -0.247 | 0.791 |
| 88.1647452584604 | 0.327 | 0.678 | -0.253 | 0.807 |
| 88.33209371513574 | 0.346 | 0.686 | -0.261 | 0.826 |
| 88.49944217181108 | 0.36 | 0.703 | -0.269 | 0.849 |
| 88.66679062848644 | 0.355 | 0.71 | -0.281 | 0.857 |
| 88.83413908516178 | 0.347 | 0.707 | -0.293 | 0.855 |
| 89.00148754183712 | 0.357 | 0.705 | -0.298 | 0.858 |
| 89.16883599851246 | 0.361 | 0.714 | -0.303 | 0.868 |
| 89.33618445518782 | 0.364 | 0.723 | -0.309 | 0.879 |
| 89.50353291186315 | 0.37 | 0.736 | -0.317 | 0.893 |
| 89.6708813685385 | 0.372 | 0.748 | -0.325 | 0.907 |
| 89.83822982521386 | 0.37 | 0.756 | -0.335 | 0.916 |
| 90.00557828188919 | 0.362 | 0.764 | -0.346 | 0.922 |
| 90.16362960208257 | 0.353 | 0.777 | -0.356 | 0.933 |
| 90.3309780587579 | 0.343 | 0.793 | -0.367 | 0.946 |
| 90.49832651543326 | 0.348 | 0.809 | -0.378 | 0.965 |
| 90.66567497210859 | 0.355 | 0.832 | -0.386 | 0.991 |
| 90.83302342878395 | 0.358 | 0.856 | -0.395 | 1.015 |
| 91.00037188545929 | 0.365 | 0.882 | -0.402 | 1.043 |
| 91.16772034213463 | 0.368 | 0.901 | -0.408 | 1.063 |
| 91.33506879880998 | 0.367 | 0.917 | -0.415 | 1.079 |
| 91.50241725548533 | 0.364 | 0.932 | -0.421 | 1.093 |
| 91.66976571216065 | 0.362 | 0.946 | -0.428 | 1.106 |
| 91.83711416883601 | 0.36 | 0.955 | -0.434 | 1.114 |
| 92.00446262551137 | 0.352 | 0.958 | -0.436 | 1.116 |
| 92.1718110821867 | 0.346 | 0.961 | -0.439 | 1.118 |
| 92.33915953886203 | 0.337 | 0.962 | -0.441 | 1.117 |
| 92.49721085905541 | 0.342 | 0.962 | -0.444 | 1.119 |
| 92.66455931573077 | 0.348 | 0.962 | -0.446 | 1.121 |
| 92.83190777240611 | 0.352 | 0.963 | -0.448 | 1.124 |
| 92.99925622908145 | 0.355 | 0.963 | -0.449 | 1.126 |
| 93.1666046857568 | 0.355 | 0.961 | -0.45 | 1.125 |
| 93.33395314243214 | 0.345 | 0.959 | -0.447 | 1.12 |
| 93.50130159910749 | 0.322 | 0.943 | -0.446 | 1.101 |
| 93.66865005578283 | 0.308 | 0.933 | -0.446 | 1.088 |
| 93.83599851245818 | 0.302 | 0.922 | -0.447 | 1.079 |
| 94.00334696913353 | 0.302 | 0.913 | -0.448 | 1.07 |
| 94.17069542580886 | 0.302 | 0.904 | -0.448 | 1.064 |
| 94.3380438824842 | 0.298 | 0.898 | -0.45 | 1.057 |
| 94.50539233915954 | 0.293 | 0.894 | -0.45 | 1.052 |
| 94.66344365935292 | 0.286 | 0.893 | -0.45 | 1.049 |
| 94.83079211602828 | 0.279 | 0.893 | -0.45 | 1.046 |
| 94.99814057270362 | 0.275 | 0.893 | -0.452 | 1.046 |
| 95.16548902937897 | 0.276 | 0.893 | -0.453 | 1.047 |
| 95.33283748605432 | 0.273 | 0.886 | -0.454 | 1.041 |
| 95.50018594272963 | 0.273 | 0.881 | -0.454 | 1.036 |
| 95.66753439940499 | 0.272 | 0.876 | -0.453 | 1.031 |
| 95.83488285608034 | 0.264 | 0.864 | -0.455 | 1.02 |
| 96.00223131275567 | 0.263 | 0.854 | -0.453 | 1.01 |
| 96.16957976943102 | 0.265 | 0.848 | -0.451 | 1.005 |
| 96.33692822610638 | 0.269 | 0.844 | -0.45 | 1.003 |
| 96.50427668278171 | 0.263 | 0.829 | -0.447 | 0.987 |
| 96.67162513945706 | 0.256 | 0.817 | -0.445 | 0.976 |
| 96.8389735961324 | 0.25 | 0.807 | -0.443 | 0.964 |
| 96.99702491632577 | 0.241 | 0.797 | -0.443 | 0.956 |
| 97.16437337300111 | 0.235 | 0.789 | -0.444 | 0.948 |
| 97.33172182967647 | 0.227 | 0.78 | -0.441 | 0.938 |
| 97.49907028635181 | 0.219 | 0.776 | -0.436 | 0.93 |
| 97.66641874302715 | 0.211 | 0.776 | -0.432 | 0.926 |
| 97.8337671997025 | 0.203 | 0.778 | -0.427 | 0.924 |
| 98.00111565637785 | 0.195 | 0.776 | -0.425 | 0.92 |
| 98.16846411305319 | 0.191 | 0.769 | -0.424 | 0.912 |
| 98.33581256972855 | 0.184 | 0.76 | -0.422 | 0.903 |
| 98.50316102640389 | 0.181 | 0.752 | -0.421 | 0.894 |
| 98.67050948307921 | 0.178 | 0.746 | -0.42 | 0.888 |
| 98.83785793975456 | 0.174 | 0.735 | -0.419 | 0.879 |
| 99.0052063964299 | 0.172 | 0.729 | -0.419 | 0.874 |
| 99.17255485310525 | 0.171 | 0.723 | -0.42 | 0.869 |
| 99.33060617329863 | 0.174 | 0.718 | -0.421 | 0.866 |
| 99.49795462997399 | 0.177 | 0.716 | -0.422 | 0.866 |
| 99.66530308664933 | 0.179 | 0.714 | -0.423 | 0.866 |
| 99.83265154332467 | 0.179 | 0.708 | -0.423 | 0.863 |
| 100.0 | 0.179 | 0.707 | -0.424 | 0.863 |